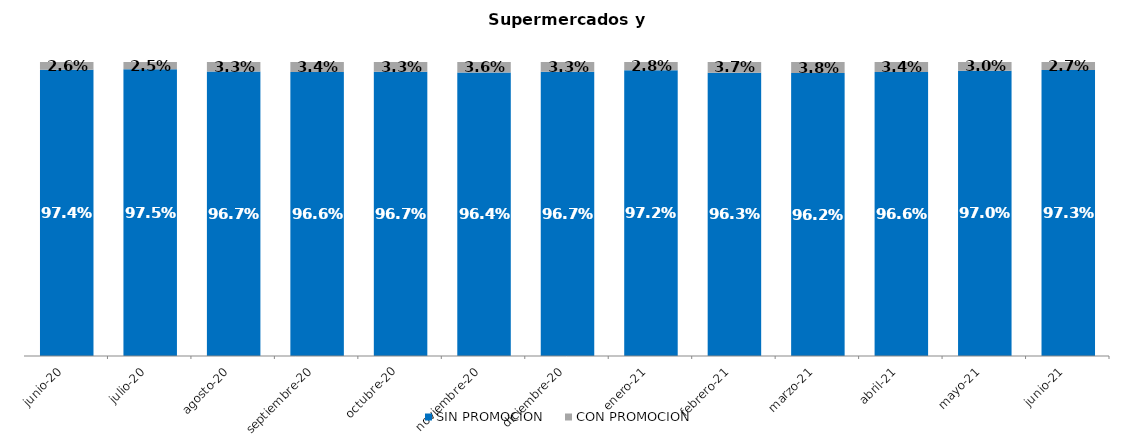
| Category | SIN PROMOCION   | CON PROMOCION   |
|---|---|---|
| 2020-06-01 | 0.974 | 0.026 |
| 2020-07-01 | 0.975 | 0.025 |
| 2020-08-01 | 0.967 | 0.033 |
| 2020-09-01 | 0.966 | 0.034 |
| 2020-10-01 | 0.967 | 0.033 |
| 2020-11-01 | 0.964 | 0.036 |
| 2020-12-01 | 0.967 | 0.033 |
| 2021-01-01 | 0.972 | 0.028 |
| 2021-02-01 | 0.963 | 0.037 |
| 2021-03-01 | 0.962 | 0.038 |
| 2021-04-01 | 0.966 | 0.034 |
| 2021-05-01 | 0.97 | 0.03 |
| 2021-06-01 | 0.973 | 0.027 |